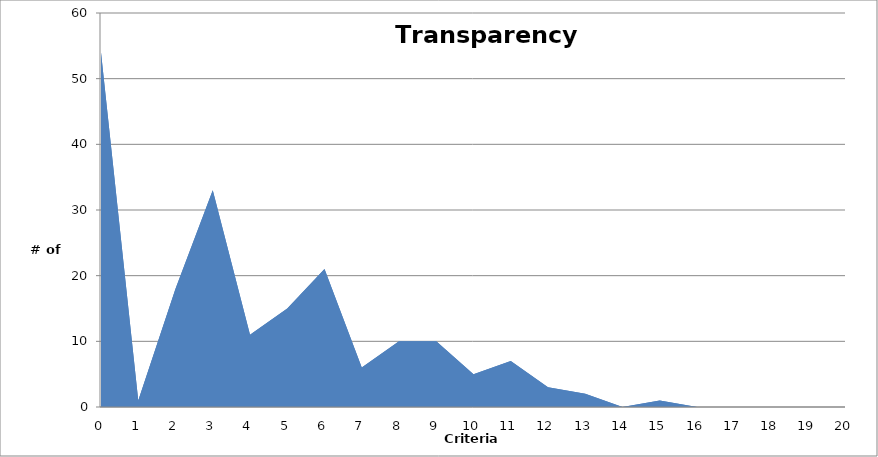
| Category | Series 0 | Series 1 |
|---|---|---|
| 0.0 | 54 | 54 |
| 1.0 | 1 | 1 |
| 2.0 | 18 | 18 |
| 3.0 | 33 | 33 |
| 4.0 | 11 | 11 |
| 5.0 | 15 | 15 |
| 6.0 | 21 | 21 |
| 7.0 | 6 | 6 |
| 8.0 | 10 | 10 |
| 9.0 | 10 | 10 |
| 10.0 | 5 | 5 |
| 11.0 | 7 | 7 |
| 12.0 | 3 | 3 |
| 13.0 | 2 | 2 |
| 14.0 | 0 | 0 |
| 15.0 | 1 | 1 |
| 16.0 | 0 | 0 |
| 17.0 | 0 | 0 |
| 18.0 | 0 | 0 |
| 19.0 | 0 | 0 |
| 20.0 | 0 | 0 |